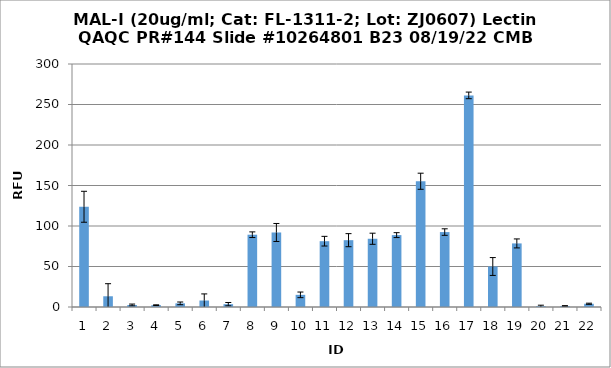
| Category | Series 0 |
|---|---|
| 0 | 123.75 |
| 1 | 13.25 |
| 2 | 2.5 |
| 3 | 2.25 |
| 4 | 4.5 |
| 5 | 8 |
| 6 | 3.5 |
| 7 | 89.25 |
| 8 | 92 |
| 9 | 15 |
| 10 | 81.25 |
| 11 | 82.5 |
| 12 | 84.25 |
| 13 | 88.75 |
| 14 | 155.25 |
| 15 | 92.5 |
| 16 | 261.25 |
| 17 | 50 |
| 18 | 78.5 |
| 19 | 1 |
| 20 | 1.25 |
| 21 | 4 |